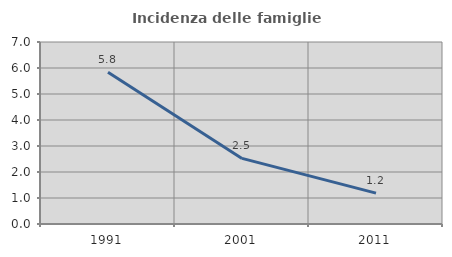
| Category | Incidenza delle famiglie numerose |
|---|---|
| 1991.0 | 5.837 |
| 2001.0 | 2.523 |
| 2011.0 | 1.187 |